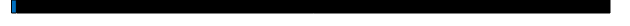
| Category | Series 0 | Series 1 |
|---|---|---|
| 0 | 0.895 | 99.105 |